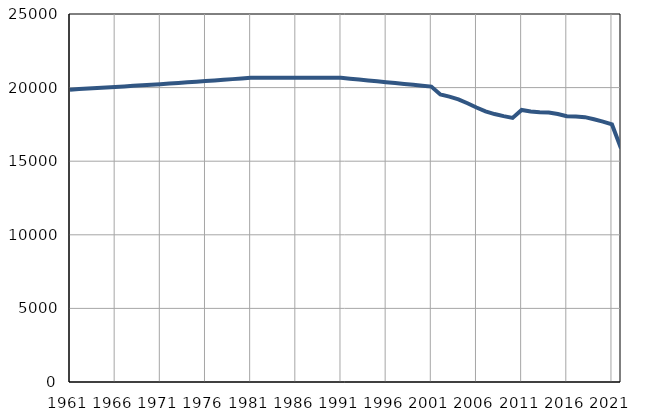
| Category | Population
size |
|---|---|
| 1961.0 | 19860 |
| 1962.0 | 19897 |
| 1963.0 | 19934 |
| 1964.0 | 19970 |
| 1965.0 | 20007 |
| 1966.0 | 20044 |
| 1967.0 | 20081 |
| 1968.0 | 20118 |
| 1969.0 | 20154 |
| 1970.0 | 20191 |
| 1971.0 | 20228 |
| 1972.0 | 20272 |
| 1973.0 | 20316 |
| 1974.0 | 20359 |
| 1975.0 | 20401 |
| 1976.0 | 20446 |
| 1977.0 | 20489 |
| 1978.0 | 20533 |
| 1979.0 | 20576 |
| 1980.0 | 20620 |
| 1981.0 | 20663 |
| 1982.0 | 20663 |
| 1983.0 | 20663 |
| 1984.0 | 20663 |
| 1985.0 | 20663 |
| 1986.0 | 20663 |
| 1987.0 | 20662 |
| 1988.0 | 20662 |
| 1989.0 | 20662 |
| 1990.0 | 20662 |
| 1991.0 | 20662 |
| 1992.0 | 20603 |
| 1993.0 | 20544 |
| 1994.0 | 20484 |
| 1995.0 | 20425 |
| 1996.0 | 20365 |
| 1997.0 | 20306 |
| 1998.0 | 20246 |
| 1999.0 | 20187 |
| 2000.0 | 20128 |
| 2001.0 | 20068 |
| 2002.0 | 19534 |
| 2003.0 | 19383 |
| 2004.0 | 19200 |
| 2005.0 | 18939 |
| 2006.0 | 18645 |
| 2007.0 | 18389 |
| 2008.0 | 18202 |
| 2009.0 | 18061 |
| 2010.0 | 17941 |
| 2011.0 | 18482 |
| 2012.0 | 18376 |
| 2013.0 | 18319 |
| 2014.0 | 18305 |
| 2015.0 | 18208 |
| 2016.0 | 18059 |
| 2017.0 | 18030 |
| 2018.0 | 17991 |
| 2019.0 | 17846 |
| 2020.0 | 17690 |
| 2021.0 | 17497 |
| 2022.0 | 15873 |